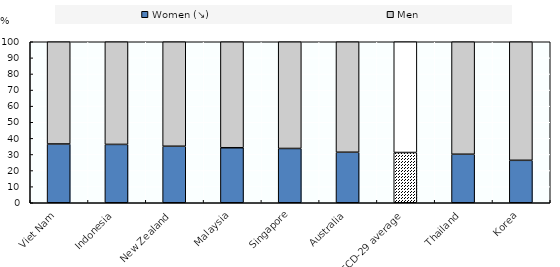
| Category | Women (↘) | Men |
|---|---|---|
| Viet Nam | 36.509 | 63.491 |
| Indonesia | 36.244 | 63.756 |
| New Zealand | 35.097 | 64.903 |
| Malaysia | 34.167 | 65.833 |
| Singapore | 33.716 | 66.284 |
| Australia | 31.378 | 68.622 |
| OECD-29 average | 31.209 | 68.791 |
| Thailand | 30.136 | 69.864 |
| Korea | 26.361 | 73.639 |